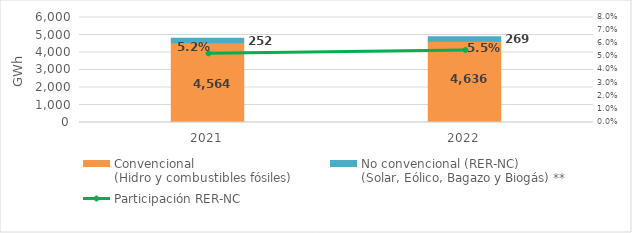
| Category | Convencional
(Hidro y combustibles fósiles) | No convencional (RER-NC)
(Solar, Eólico, Bagazo y Biogás) ** |
|---|---|---|
| 2021.0 | 4564.133 | 251.82 |
| 2022.0 | 4636.172 | 269.24 |